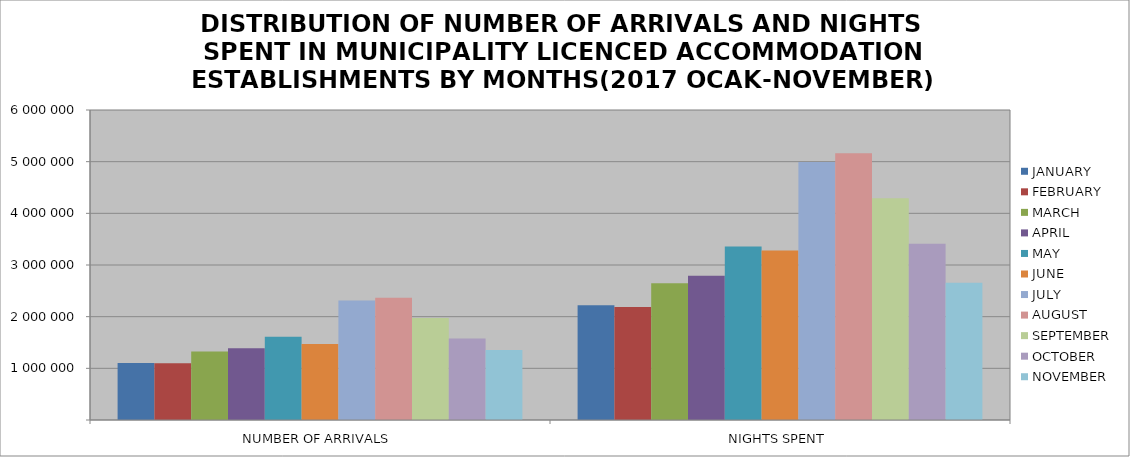
| Category | JANUARY | FEBRUARY | MARCH | APRIL | MAY | JUNE | JULY | AUGUST | SEPTEMBER | OCTOBER | NOVEMBER |
|---|---|---|---|---|---|---|---|---|---|---|---|
| NUMBER OF ARRIVALS | 1104649 | 1099366 | 1327993 | 1389075 | 1611959 | 1472053 | 2311504 | 2364597 | 1973724 | 1579336 | 1353274 |
| NIGHTS SPENT | 2222261 | 2187982 | 2645959 | 2791881 | 3355819 | 3280620 | 4994703 | 5161854 | 4292043 | 3411995 | 2656976 |